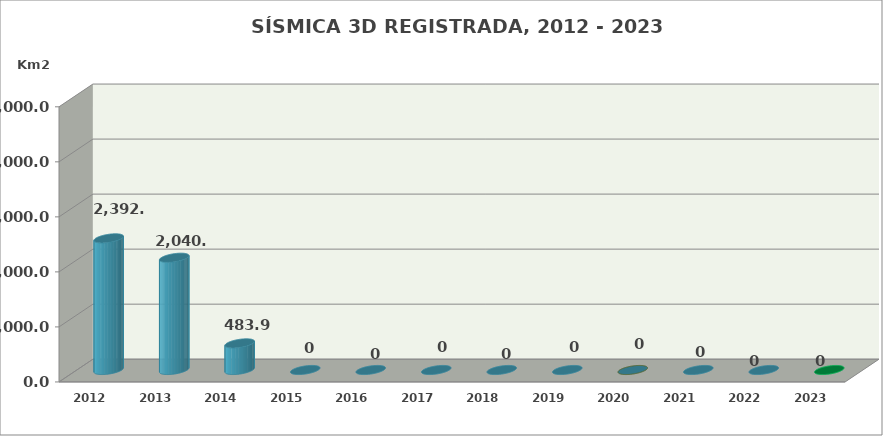
| Category | Series 0 |
|---|---|
| 2012.0 | 2392.47 |
| 2013.0 | 2040.1 |
| 2014.0 | 483.9 |
| 2015.0 | 0 |
| 2016.0 | 0 |
| 2017.0 | 0 |
| 2018.0 | 0 |
| 2019.0 | 0 |
| 2020.0 | 0 |
| 2021.0 | 0 |
| 2022.0 | 0 |
| 2023.0 | 0 |